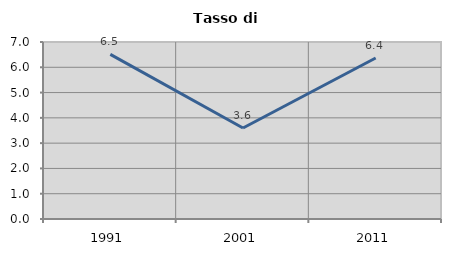
| Category | Tasso di disoccupazione   |
|---|---|
| 1991.0 | 6.51 |
| 2001.0 | 3.6 |
| 2011.0 | 6.368 |